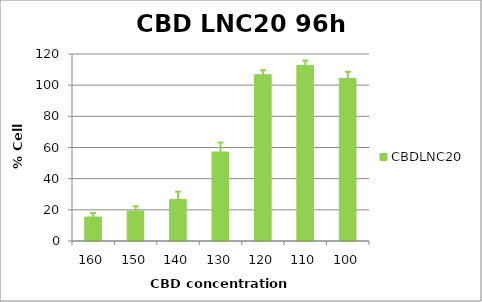
| Category | CBDLNC20 |
|---|---|
| 160.0 | 15.362 |
| 150.0 | 19.28 |
| 140.0 | 26.75 |
| 130.0 | 57.123 |
| 120.0 | 106.716 |
| 110.0 | 112.68 |
| 100.0 | 104.265 |